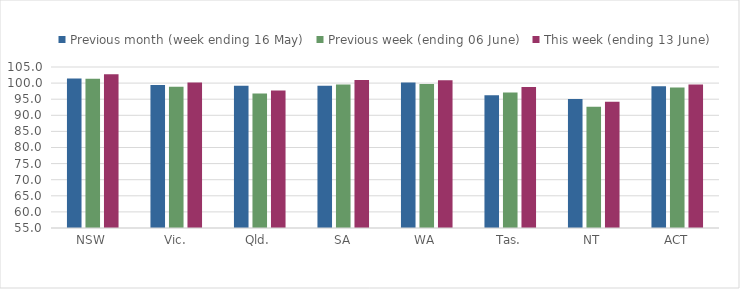
| Category | Previous month (week ending 16 May) | Previous week (ending 06 June) | This week (ending 13 June) |
|---|---|---|---|
| NSW | 101.415 | 101.323 | 102.786 |
| Vic. | 99.405 | 98.891 | 100.198 |
| Qld. | 99.179 | 96.774 | 97.704 |
| SA | 99.149 | 99.574 | 100.99 |
| WA | 100.21 | 99.759 | 100.853 |
| Tas. | 96.26 | 97.077 | 98.827 |
| NT | 95.032 | 92.657 | 94.179 |
| ACT | 99.02 | 98.607 | 99.579 |